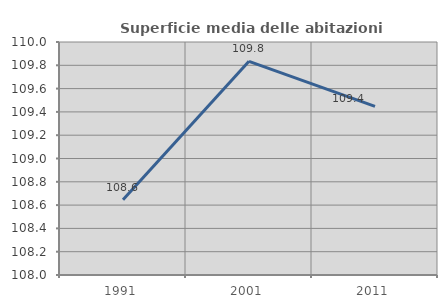
| Category | Superficie media delle abitazioni occupate |
|---|---|
| 1991.0 | 108.645 |
| 2001.0 | 109.834 |
| 2011.0 | 109.447 |